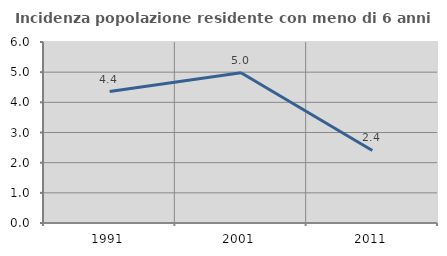
| Category | Incidenza popolazione residente con meno di 6 anni |
|---|---|
| 1991.0 | 4.356 |
| 2001.0 | 4.979 |
| 2011.0 | 2.404 |